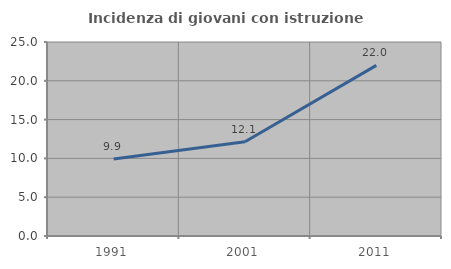
| Category | Incidenza di giovani con istruzione universitaria |
|---|---|
| 1991.0 | 9.919 |
| 2001.0 | 12.15 |
| 2011.0 | 21.989 |